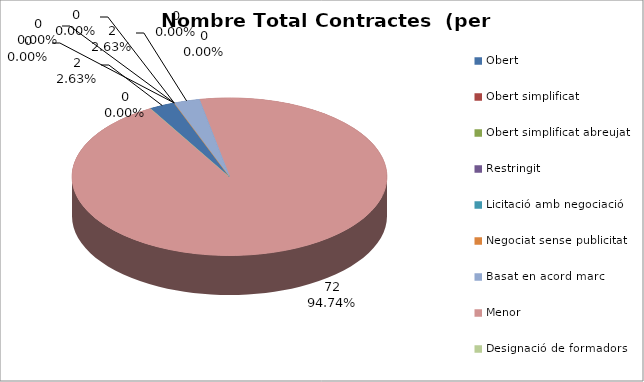
| Category | Nombre Total Contractes |
|---|---|
| Obert | 2 |
| Obert simplificat | 0 |
| Obert simplificat abreujat | 0 |
| Restringit | 0 |
| Licitació amb negociació | 0 |
| Negociat sense publicitat | 0 |
| Basat en acord marc | 2 |
| Menor | 72 |
| Designació de formadors | 0 |